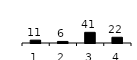
| Category | Series 0 |
|---|---|
| 1.0 | 11 |
| 2.0 | 6 |
| 3.0 | 41 |
| 4.0 | 22 |